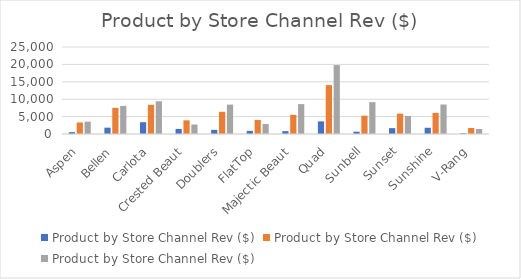
| Category | E-mail Coupon | In Store Sales | Web Site Sales |
|---|---|---|---|
| Aspen | 529.03 | 3305.82 | 3542.59 |
| Bellen | 1817.69 | 7517.43 | 8075.36 |
| Carlota | 3394.39 | 8390.63 | 9410.38 |
| Crested Beaut | 1460.94 | 3924.76 | 2721.39 |
| Doublers | 1190.92 | 6374.92 | 8439.76 |
| FlatTop | 902.56 | 4051.21 | 2864.12 |
| Majectic Beaut | 820.65 | 5502.82 | 8595.65 |
| Quad | 3634.4 | 14052.89 | 19803.54 |
| Sunbell | 659.97 | 5262.51 | 9154.37 |
| Sunset | 1686.65 | 5859.34 | 5184.85 |
| Sunshine | 1790.68 | 6088.18 | 8470.9 |
| V-Rang | 204.83 | 1721.47 | 1431.55 |